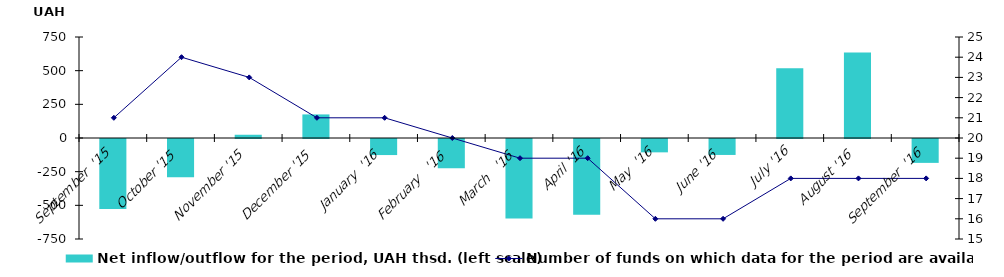
| Category | Net inflow/outflow for the period, UAH thsd. (left scale) |
|---|---|
| September  '15 | -519.797 |
| October '15 | -284.598 |
| November '15 | 24.138 |
| December '15 | 175.058 |
| January  '16 | -119.266 |
| February   '16 | -217.198 |
| March   '16 | -589.857 |
| April '16 | -562.819 |
| May  '16 | -99.11 |
| June '16 | -118.43 |
| July '16 | 518.723 |
| August '16 | 634.208 |
| September  '16 | -177.364 |